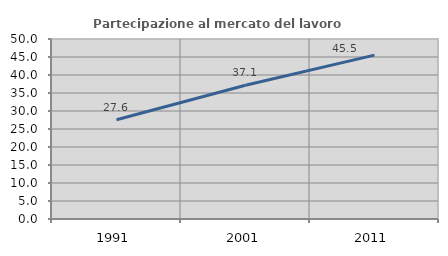
| Category | Partecipazione al mercato del lavoro  femminile |
|---|---|
| 1991.0 | 27.572 |
| 2001.0 | 37.143 |
| 2011.0 | 45.52 |